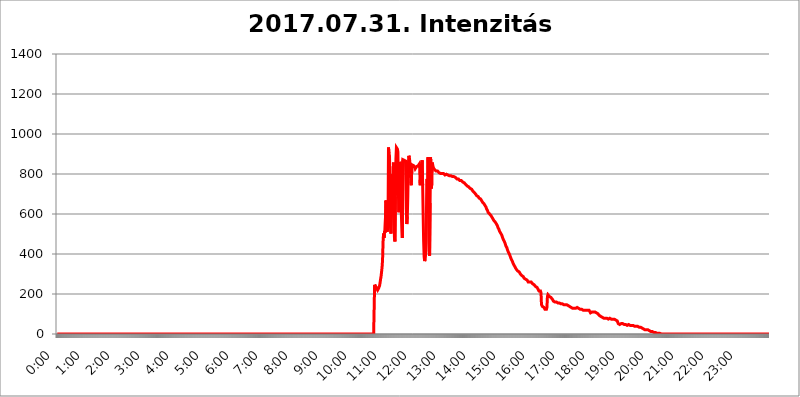
| Category | 2017.07.31. Intenzitás [W/m^2] |
|---|---|
| 0.0 | 0 |
| 0.0006944444444444445 | 0 |
| 0.001388888888888889 | 0 |
| 0.0020833333333333333 | 0 |
| 0.002777777777777778 | 0 |
| 0.003472222222222222 | 0 |
| 0.004166666666666667 | 0 |
| 0.004861111111111111 | 0 |
| 0.005555555555555556 | 0 |
| 0.0062499999999999995 | 0 |
| 0.006944444444444444 | 0 |
| 0.007638888888888889 | 0 |
| 0.008333333333333333 | 0 |
| 0.009027777777777779 | 0 |
| 0.009722222222222222 | 0 |
| 0.010416666666666666 | 0 |
| 0.011111111111111112 | 0 |
| 0.011805555555555555 | 0 |
| 0.012499999999999999 | 0 |
| 0.013194444444444444 | 0 |
| 0.013888888888888888 | 0 |
| 0.014583333333333332 | 0 |
| 0.015277777777777777 | 0 |
| 0.015972222222222224 | 0 |
| 0.016666666666666666 | 0 |
| 0.017361111111111112 | 0 |
| 0.018055555555555557 | 0 |
| 0.01875 | 0 |
| 0.019444444444444445 | 0 |
| 0.02013888888888889 | 0 |
| 0.020833333333333332 | 0 |
| 0.02152777777777778 | 0 |
| 0.022222222222222223 | 0 |
| 0.02291666666666667 | 0 |
| 0.02361111111111111 | 0 |
| 0.024305555555555556 | 0 |
| 0.024999999999999998 | 0 |
| 0.025694444444444447 | 0 |
| 0.02638888888888889 | 0 |
| 0.027083333333333334 | 0 |
| 0.027777777777777776 | 0 |
| 0.02847222222222222 | 0 |
| 0.029166666666666664 | 0 |
| 0.029861111111111113 | 0 |
| 0.030555555555555555 | 0 |
| 0.03125 | 0 |
| 0.03194444444444445 | 0 |
| 0.03263888888888889 | 0 |
| 0.03333333333333333 | 0 |
| 0.034027777777777775 | 0 |
| 0.034722222222222224 | 0 |
| 0.035416666666666666 | 0 |
| 0.036111111111111115 | 0 |
| 0.03680555555555556 | 0 |
| 0.0375 | 0 |
| 0.03819444444444444 | 0 |
| 0.03888888888888889 | 0 |
| 0.03958333333333333 | 0 |
| 0.04027777777777778 | 0 |
| 0.04097222222222222 | 0 |
| 0.041666666666666664 | 0 |
| 0.042361111111111106 | 0 |
| 0.04305555555555556 | 0 |
| 0.043750000000000004 | 0 |
| 0.044444444444444446 | 0 |
| 0.04513888888888889 | 0 |
| 0.04583333333333334 | 0 |
| 0.04652777777777778 | 0 |
| 0.04722222222222222 | 0 |
| 0.04791666666666666 | 0 |
| 0.04861111111111111 | 0 |
| 0.049305555555555554 | 0 |
| 0.049999999999999996 | 0 |
| 0.05069444444444445 | 0 |
| 0.051388888888888894 | 0 |
| 0.052083333333333336 | 0 |
| 0.05277777777777778 | 0 |
| 0.05347222222222222 | 0 |
| 0.05416666666666667 | 0 |
| 0.05486111111111111 | 0 |
| 0.05555555555555555 | 0 |
| 0.05625 | 0 |
| 0.05694444444444444 | 0 |
| 0.057638888888888885 | 0 |
| 0.05833333333333333 | 0 |
| 0.05902777777777778 | 0 |
| 0.059722222222222225 | 0 |
| 0.06041666666666667 | 0 |
| 0.061111111111111116 | 0 |
| 0.06180555555555556 | 0 |
| 0.0625 | 0 |
| 0.06319444444444444 | 0 |
| 0.06388888888888888 | 0 |
| 0.06458333333333334 | 0 |
| 0.06527777777777778 | 0 |
| 0.06597222222222222 | 0 |
| 0.06666666666666667 | 0 |
| 0.06736111111111111 | 0 |
| 0.06805555555555555 | 0 |
| 0.06874999999999999 | 0 |
| 0.06944444444444443 | 0 |
| 0.07013888888888889 | 0 |
| 0.07083333333333333 | 0 |
| 0.07152777777777779 | 0 |
| 0.07222222222222223 | 0 |
| 0.07291666666666667 | 0 |
| 0.07361111111111111 | 0 |
| 0.07430555555555556 | 0 |
| 0.075 | 0 |
| 0.07569444444444444 | 0 |
| 0.0763888888888889 | 0 |
| 0.07708333333333334 | 0 |
| 0.07777777777777778 | 0 |
| 0.07847222222222222 | 0 |
| 0.07916666666666666 | 0 |
| 0.0798611111111111 | 0 |
| 0.08055555555555556 | 0 |
| 0.08125 | 0 |
| 0.08194444444444444 | 0 |
| 0.08263888888888889 | 0 |
| 0.08333333333333333 | 0 |
| 0.08402777777777777 | 0 |
| 0.08472222222222221 | 0 |
| 0.08541666666666665 | 0 |
| 0.08611111111111112 | 0 |
| 0.08680555555555557 | 0 |
| 0.08750000000000001 | 0 |
| 0.08819444444444445 | 0 |
| 0.08888888888888889 | 0 |
| 0.08958333333333333 | 0 |
| 0.09027777777777778 | 0 |
| 0.09097222222222222 | 0 |
| 0.09166666666666667 | 0 |
| 0.09236111111111112 | 0 |
| 0.09305555555555556 | 0 |
| 0.09375 | 0 |
| 0.09444444444444444 | 0 |
| 0.09513888888888888 | 0 |
| 0.09583333333333333 | 0 |
| 0.09652777777777777 | 0 |
| 0.09722222222222222 | 0 |
| 0.09791666666666667 | 0 |
| 0.09861111111111111 | 0 |
| 0.09930555555555555 | 0 |
| 0.09999999999999999 | 0 |
| 0.10069444444444443 | 0 |
| 0.1013888888888889 | 0 |
| 0.10208333333333335 | 0 |
| 0.10277777777777779 | 0 |
| 0.10347222222222223 | 0 |
| 0.10416666666666667 | 0 |
| 0.10486111111111111 | 0 |
| 0.10555555555555556 | 0 |
| 0.10625 | 0 |
| 0.10694444444444444 | 0 |
| 0.1076388888888889 | 0 |
| 0.10833333333333334 | 0 |
| 0.10902777777777778 | 0 |
| 0.10972222222222222 | 0 |
| 0.1111111111111111 | 0 |
| 0.11180555555555556 | 0 |
| 0.11180555555555556 | 0 |
| 0.1125 | 0 |
| 0.11319444444444444 | 0 |
| 0.11388888888888889 | 0 |
| 0.11458333333333333 | 0 |
| 0.11527777777777777 | 0 |
| 0.11597222222222221 | 0 |
| 0.11666666666666665 | 0 |
| 0.1173611111111111 | 0 |
| 0.11805555555555557 | 0 |
| 0.11944444444444445 | 0 |
| 0.12013888888888889 | 0 |
| 0.12083333333333333 | 0 |
| 0.12152777777777778 | 0 |
| 0.12222222222222223 | 0 |
| 0.12291666666666667 | 0 |
| 0.12291666666666667 | 0 |
| 0.12361111111111112 | 0 |
| 0.12430555555555556 | 0 |
| 0.125 | 0 |
| 0.12569444444444444 | 0 |
| 0.12638888888888888 | 0 |
| 0.12708333333333333 | 0 |
| 0.16875 | 0 |
| 0.12847222222222224 | 0 |
| 0.12916666666666668 | 0 |
| 0.12986111111111112 | 0 |
| 0.13055555555555556 | 0 |
| 0.13125 | 0 |
| 0.13194444444444445 | 0 |
| 0.1326388888888889 | 0 |
| 0.13333333333333333 | 0 |
| 0.13402777777777777 | 0 |
| 0.13402777777777777 | 0 |
| 0.13472222222222222 | 0 |
| 0.13541666666666666 | 0 |
| 0.1361111111111111 | 0 |
| 0.13749999999999998 | 0 |
| 0.13819444444444443 | 0 |
| 0.1388888888888889 | 0 |
| 0.13958333333333334 | 0 |
| 0.14027777777777778 | 0 |
| 0.14097222222222222 | 0 |
| 0.14166666666666666 | 0 |
| 0.1423611111111111 | 0 |
| 0.14305555555555557 | 0 |
| 0.14375000000000002 | 0 |
| 0.14444444444444446 | 0 |
| 0.1451388888888889 | 0 |
| 0.1451388888888889 | 0 |
| 0.14652777777777778 | 0 |
| 0.14722222222222223 | 0 |
| 0.14791666666666667 | 0 |
| 0.1486111111111111 | 0 |
| 0.14930555555555555 | 0 |
| 0.15 | 0 |
| 0.15069444444444444 | 0 |
| 0.15138888888888888 | 0 |
| 0.15208333333333332 | 0 |
| 0.15277777777777776 | 0 |
| 0.15347222222222223 | 0 |
| 0.15416666666666667 | 0 |
| 0.15486111111111112 | 0 |
| 0.15555555555555556 | 0 |
| 0.15625 | 0 |
| 0.15694444444444444 | 0 |
| 0.15763888888888888 | 0 |
| 0.15833333333333333 | 0 |
| 0.15902777777777777 | 0 |
| 0.15972222222222224 | 0 |
| 0.16041666666666668 | 0 |
| 0.16111111111111112 | 0 |
| 0.16180555555555556 | 0 |
| 0.1625 | 0 |
| 0.16319444444444445 | 0 |
| 0.1638888888888889 | 0 |
| 0.16458333333333333 | 0 |
| 0.16527777777777777 | 0 |
| 0.16597222222222222 | 0 |
| 0.16666666666666666 | 0 |
| 0.1673611111111111 | 0 |
| 0.16805555555555554 | 0 |
| 0.16874999999999998 | 0 |
| 0.16944444444444443 | 0 |
| 0.17013888888888887 | 0 |
| 0.1708333333333333 | 0 |
| 0.17152777777777775 | 0 |
| 0.17222222222222225 | 0 |
| 0.1729166666666667 | 0 |
| 0.17361111111111113 | 0 |
| 0.17430555555555557 | 0 |
| 0.17500000000000002 | 0 |
| 0.17569444444444446 | 0 |
| 0.1763888888888889 | 0 |
| 0.17708333333333334 | 0 |
| 0.17777777777777778 | 0 |
| 0.17847222222222223 | 0 |
| 0.17916666666666667 | 0 |
| 0.1798611111111111 | 0 |
| 0.18055555555555555 | 0 |
| 0.18125 | 0 |
| 0.18194444444444444 | 0 |
| 0.1826388888888889 | 0 |
| 0.18333333333333335 | 0 |
| 0.1840277777777778 | 0 |
| 0.18472222222222223 | 0 |
| 0.18541666666666667 | 0 |
| 0.18611111111111112 | 0 |
| 0.18680555555555556 | 0 |
| 0.1875 | 0 |
| 0.18819444444444444 | 0 |
| 0.18888888888888888 | 0 |
| 0.18958333333333333 | 0 |
| 0.19027777777777777 | 0 |
| 0.1909722222222222 | 0 |
| 0.19166666666666665 | 0 |
| 0.19236111111111112 | 0 |
| 0.19305555555555554 | 0 |
| 0.19375 | 0 |
| 0.19444444444444445 | 0 |
| 0.1951388888888889 | 0 |
| 0.19583333333333333 | 0 |
| 0.19652777777777777 | 0 |
| 0.19722222222222222 | 0 |
| 0.19791666666666666 | 0 |
| 0.1986111111111111 | 0 |
| 0.19930555555555554 | 0 |
| 0.19999999999999998 | 0 |
| 0.20069444444444443 | 0 |
| 0.20138888888888887 | 0 |
| 0.2020833333333333 | 0 |
| 0.2027777777777778 | 0 |
| 0.2034722222222222 | 0 |
| 0.2041666666666667 | 0 |
| 0.20486111111111113 | 0 |
| 0.20555555555555557 | 0 |
| 0.20625000000000002 | 0 |
| 0.20694444444444446 | 0 |
| 0.2076388888888889 | 0 |
| 0.20833333333333334 | 0 |
| 0.20902777777777778 | 0 |
| 0.20972222222222223 | 0 |
| 0.21041666666666667 | 0 |
| 0.2111111111111111 | 0 |
| 0.21180555555555555 | 0 |
| 0.2125 | 0 |
| 0.21319444444444444 | 0 |
| 0.2138888888888889 | 0 |
| 0.21458333333333335 | 0 |
| 0.2152777777777778 | 0 |
| 0.21597222222222223 | 0 |
| 0.21666666666666667 | 0 |
| 0.21736111111111112 | 0 |
| 0.21805555555555556 | 0 |
| 0.21875 | 0 |
| 0.21944444444444444 | 0 |
| 0.22013888888888888 | 0 |
| 0.22083333333333333 | 0 |
| 0.22152777777777777 | 0 |
| 0.2222222222222222 | 0 |
| 0.22291666666666665 | 0 |
| 0.2236111111111111 | 0 |
| 0.22430555555555556 | 0 |
| 0.225 | 0 |
| 0.22569444444444445 | 0 |
| 0.2263888888888889 | 0 |
| 0.22708333333333333 | 0 |
| 0.22777777777777777 | 0 |
| 0.22847222222222222 | 0 |
| 0.22916666666666666 | 0 |
| 0.2298611111111111 | 0 |
| 0.23055555555555554 | 0 |
| 0.23124999999999998 | 0 |
| 0.23194444444444443 | 0 |
| 0.23263888888888887 | 0 |
| 0.2333333333333333 | 0 |
| 0.2340277777777778 | 0 |
| 0.2347222222222222 | 0 |
| 0.2354166666666667 | 0 |
| 0.23611111111111113 | 0 |
| 0.23680555555555557 | 0 |
| 0.23750000000000002 | 0 |
| 0.23819444444444446 | 0 |
| 0.2388888888888889 | 0 |
| 0.23958333333333334 | 0 |
| 0.24027777777777778 | 0 |
| 0.24097222222222223 | 0 |
| 0.24166666666666667 | 0 |
| 0.2423611111111111 | 0 |
| 0.24305555555555555 | 0 |
| 0.24375 | 0 |
| 0.24444444444444446 | 0 |
| 0.24513888888888888 | 0 |
| 0.24583333333333335 | 0 |
| 0.2465277777777778 | 0 |
| 0.24722222222222223 | 0 |
| 0.24791666666666667 | 0 |
| 0.24861111111111112 | 0 |
| 0.24930555555555556 | 0 |
| 0.25 | 0 |
| 0.25069444444444444 | 0 |
| 0.2513888888888889 | 0 |
| 0.2520833333333333 | 0 |
| 0.25277777777777777 | 0 |
| 0.2534722222222222 | 0 |
| 0.25416666666666665 | 0 |
| 0.2548611111111111 | 0 |
| 0.2555555555555556 | 0 |
| 0.25625000000000003 | 0 |
| 0.2569444444444445 | 0 |
| 0.2576388888888889 | 0 |
| 0.25833333333333336 | 0 |
| 0.2590277777777778 | 0 |
| 0.25972222222222224 | 0 |
| 0.2604166666666667 | 0 |
| 0.2611111111111111 | 0 |
| 0.26180555555555557 | 0 |
| 0.2625 | 0 |
| 0.26319444444444445 | 0 |
| 0.2638888888888889 | 0 |
| 0.26458333333333334 | 0 |
| 0.2652777777777778 | 0 |
| 0.2659722222222222 | 0 |
| 0.26666666666666666 | 0 |
| 0.2673611111111111 | 0 |
| 0.26805555555555555 | 0 |
| 0.26875 | 0 |
| 0.26944444444444443 | 0 |
| 0.2701388888888889 | 0 |
| 0.2708333333333333 | 0 |
| 0.27152777777777776 | 0 |
| 0.2722222222222222 | 0 |
| 0.27291666666666664 | 0 |
| 0.2736111111111111 | 0 |
| 0.2743055555555555 | 0 |
| 0.27499999999999997 | 0 |
| 0.27569444444444446 | 0 |
| 0.27638888888888885 | 0 |
| 0.27708333333333335 | 0 |
| 0.2777777777777778 | 0 |
| 0.27847222222222223 | 0 |
| 0.2791666666666667 | 0 |
| 0.2798611111111111 | 0 |
| 0.28055555555555556 | 0 |
| 0.28125 | 0 |
| 0.28194444444444444 | 0 |
| 0.2826388888888889 | 0 |
| 0.2833333333333333 | 0 |
| 0.28402777777777777 | 0 |
| 0.2847222222222222 | 0 |
| 0.28541666666666665 | 0 |
| 0.28611111111111115 | 0 |
| 0.28680555555555554 | 0 |
| 0.28750000000000003 | 0 |
| 0.2881944444444445 | 0 |
| 0.2888888888888889 | 0 |
| 0.28958333333333336 | 0 |
| 0.2902777777777778 | 0 |
| 0.29097222222222224 | 0 |
| 0.2916666666666667 | 0 |
| 0.2923611111111111 | 0 |
| 0.29305555555555557 | 0 |
| 0.29375 | 0 |
| 0.29444444444444445 | 0 |
| 0.2951388888888889 | 0 |
| 0.29583333333333334 | 0 |
| 0.2965277777777778 | 0 |
| 0.2972222222222222 | 0 |
| 0.29791666666666666 | 0 |
| 0.2986111111111111 | 0 |
| 0.29930555555555555 | 0 |
| 0.3 | 0 |
| 0.30069444444444443 | 0 |
| 0.3013888888888889 | 0 |
| 0.3020833333333333 | 0 |
| 0.30277777777777776 | 0 |
| 0.3034722222222222 | 0 |
| 0.30416666666666664 | 0 |
| 0.3048611111111111 | 0 |
| 0.3055555555555555 | 0 |
| 0.30624999999999997 | 0 |
| 0.3069444444444444 | 0 |
| 0.3076388888888889 | 0 |
| 0.30833333333333335 | 0 |
| 0.3090277777777778 | 0 |
| 0.30972222222222223 | 0 |
| 0.3104166666666667 | 0 |
| 0.3111111111111111 | 0 |
| 0.31180555555555556 | 0 |
| 0.3125 | 0 |
| 0.31319444444444444 | 0 |
| 0.3138888888888889 | 0 |
| 0.3145833333333333 | 0 |
| 0.31527777777777777 | 0 |
| 0.3159722222222222 | 0 |
| 0.31666666666666665 | 0 |
| 0.31736111111111115 | 0 |
| 0.31805555555555554 | 0 |
| 0.31875000000000003 | 0 |
| 0.3194444444444445 | 0 |
| 0.3201388888888889 | 0 |
| 0.32083333333333336 | 0 |
| 0.3215277777777778 | 0 |
| 0.32222222222222224 | 0 |
| 0.3229166666666667 | 0 |
| 0.3236111111111111 | 0 |
| 0.32430555555555557 | 0 |
| 0.325 | 0 |
| 0.32569444444444445 | 0 |
| 0.3263888888888889 | 0 |
| 0.32708333333333334 | 0 |
| 0.3277777777777778 | 0 |
| 0.3284722222222222 | 0 |
| 0.32916666666666666 | 0 |
| 0.3298611111111111 | 0 |
| 0.33055555555555555 | 0 |
| 0.33125 | 0 |
| 0.33194444444444443 | 0 |
| 0.3326388888888889 | 0 |
| 0.3333333333333333 | 0 |
| 0.3340277777777778 | 0 |
| 0.3347222222222222 | 0 |
| 0.3354166666666667 | 0 |
| 0.3361111111111111 | 0 |
| 0.3368055555555556 | 0 |
| 0.33749999999999997 | 0 |
| 0.33819444444444446 | 0 |
| 0.33888888888888885 | 0 |
| 0.33958333333333335 | 0 |
| 0.34027777777777773 | 0 |
| 0.34097222222222223 | 0 |
| 0.3416666666666666 | 0 |
| 0.3423611111111111 | 0 |
| 0.3430555555555555 | 0 |
| 0.34375 | 0 |
| 0.3444444444444445 | 0 |
| 0.3451388888888889 | 0 |
| 0.3458333333333334 | 0 |
| 0.34652777777777777 | 0 |
| 0.34722222222222227 | 0 |
| 0.34791666666666665 | 0 |
| 0.34861111111111115 | 0 |
| 0.34930555555555554 | 0 |
| 0.35000000000000003 | 0 |
| 0.3506944444444444 | 0 |
| 0.3513888888888889 | 0 |
| 0.3520833333333333 | 0 |
| 0.3527777777777778 | 0 |
| 0.3534722222222222 | 0 |
| 0.3541666666666667 | 0 |
| 0.3548611111111111 | 0 |
| 0.35555555555555557 | 0 |
| 0.35625 | 0 |
| 0.35694444444444445 | 0 |
| 0.3576388888888889 | 0 |
| 0.35833333333333334 | 0 |
| 0.3590277777777778 | 0 |
| 0.3597222222222222 | 0 |
| 0.36041666666666666 | 0 |
| 0.3611111111111111 | 0 |
| 0.36180555555555555 | 0 |
| 0.3625 | 0 |
| 0.36319444444444443 | 0 |
| 0.3638888888888889 | 0 |
| 0.3645833333333333 | 0 |
| 0.3652777777777778 | 0 |
| 0.3659722222222222 | 0 |
| 0.3666666666666667 | 0 |
| 0.3673611111111111 | 0 |
| 0.3680555555555556 | 0 |
| 0.36874999999999997 | 0 |
| 0.36944444444444446 | 0 |
| 0.37013888888888885 | 0 |
| 0.37083333333333335 | 0 |
| 0.37152777777777773 | 0 |
| 0.37222222222222223 | 0 |
| 0.3729166666666666 | 0 |
| 0.3736111111111111 | 0 |
| 0.3743055555555555 | 0 |
| 0.375 | 0 |
| 0.3756944444444445 | 0 |
| 0.3763888888888889 | 0 |
| 0.3770833333333334 | 0 |
| 0.37777777777777777 | 0 |
| 0.37847222222222227 | 0 |
| 0.37916666666666665 | 0 |
| 0.37986111111111115 | 0 |
| 0.38055555555555554 | 0 |
| 0.38125000000000003 | 0 |
| 0.3819444444444444 | 0 |
| 0.3826388888888889 | 0 |
| 0.3833333333333333 | 0 |
| 0.3840277777777778 | 0 |
| 0.3847222222222222 | 0 |
| 0.3854166666666667 | 0 |
| 0.3861111111111111 | 0 |
| 0.38680555555555557 | 0 |
| 0.3875 | 0 |
| 0.38819444444444445 | 0 |
| 0.3888888888888889 | 0 |
| 0.38958333333333334 | 0 |
| 0.3902777777777778 | 0 |
| 0.3909722222222222 | 0 |
| 0.39166666666666666 | 0 |
| 0.3923611111111111 | 0 |
| 0.39305555555555555 | 0 |
| 0.39375 | 0 |
| 0.39444444444444443 | 0 |
| 0.3951388888888889 | 0 |
| 0.3958333333333333 | 0 |
| 0.3965277777777778 | 0 |
| 0.3972222222222222 | 0 |
| 0.3979166666666667 | 0 |
| 0.3986111111111111 | 0 |
| 0.3993055555555556 | 0 |
| 0.39999999999999997 | 0 |
| 0.40069444444444446 | 0 |
| 0.40138888888888885 | 0 |
| 0.40208333333333335 | 0 |
| 0.40277777777777773 | 0 |
| 0.40347222222222223 | 0 |
| 0.4041666666666666 | 0 |
| 0.4048611111111111 | 0 |
| 0.4055555555555555 | 0 |
| 0.40625 | 0 |
| 0.4069444444444445 | 0 |
| 0.4076388888888889 | 0 |
| 0.4083333333333334 | 0 |
| 0.40902777777777777 | 0 |
| 0.40972222222222227 | 0 |
| 0.41041666666666665 | 0 |
| 0.41111111111111115 | 0 |
| 0.41180555555555554 | 0 |
| 0.41250000000000003 | 0 |
| 0.4131944444444444 | 0 |
| 0.4138888888888889 | 0 |
| 0.4145833333333333 | 0 |
| 0.4152777777777778 | 0 |
| 0.4159722222222222 | 0 |
| 0.4166666666666667 | 0 |
| 0.4173611111111111 | 0 |
| 0.41805555555555557 | 0 |
| 0.41875 | 0 |
| 0.41944444444444445 | 0 |
| 0.4201388888888889 | 0 |
| 0.42083333333333334 | 0 |
| 0.4215277777777778 | 0 |
| 0.4222222222222222 | 0 |
| 0.42291666666666666 | 0 |
| 0.4236111111111111 | 0 |
| 0.42430555555555555 | 0 |
| 0.425 | 0 |
| 0.42569444444444443 | 0 |
| 0.4263888888888889 | 0 |
| 0.4270833333333333 | 0 |
| 0.4277777777777778 | 0 |
| 0.4284722222222222 | 0 |
| 0.4291666666666667 | 0 |
| 0.4298611111111111 | 0 |
| 0.4305555555555556 | 0 |
| 0.43124999999999997 | 0 |
| 0.43194444444444446 | 0 |
| 0.43263888888888885 | 0 |
| 0.43333333333333335 | 0 |
| 0.43402777777777773 | 0 |
| 0.43472222222222223 | 0 |
| 0.4354166666666666 | 0 |
| 0.4361111111111111 | 0 |
| 0.4368055555555555 | 0 |
| 0.4375 | 0 |
| 0.4381944444444445 | 0 |
| 0.4388888888888889 | 0 |
| 0.4395833333333334 | 0 |
| 0.44027777777777777 | 0 |
| 0.44097222222222227 | 0 |
| 0.44166666666666665 | 0 |
| 0.44236111111111115 | 0 |
| 0.44305555555555554 | 0 |
| 0.44375000000000003 | 0 |
| 0.4444444444444444 | 0 |
| 0.4451388888888889 | 246.689 |
| 0.4458333333333333 | 242.127 |
| 0.4465277777777778 | 237.564 |
| 0.4472222222222222 | 233 |
| 0.4479166666666667 | 228.436 |
| 0.4486111111111111 | 223.873 |
| 0.44930555555555557 | 219.309 |
| 0.45 | 219.309 |
| 0.45069444444444445 | 228.436 |
| 0.4513888888888889 | 233 |
| 0.45208333333333334 | 242.127 |
| 0.4527777777777778 | 255.813 |
| 0.4534722222222222 | 274.047 |
| 0.45416666666666666 | 287.709 |
| 0.4548611111111111 | 310.44 |
| 0.45555555555555555 | 333.113 |
| 0.45625 | 369.23 |
| 0.45694444444444443 | 458.38 |
| 0.4576388888888889 | 502.192 |
| 0.4583333333333333 | 480.356 |
| 0.4590277777777778 | 515.223 |
| 0.4597222222222222 | 506.542 |
| 0.4604166666666667 | 510.885 |
| 0.4611111111111111 | 667.123 |
| 0.4618055555555556 | 617.436 |
| 0.46249999999999997 | 510.885 |
| 0.46319444444444446 | 515.223 |
| 0.46388888888888885 | 536.82 |
| 0.46458333333333335 | 932.576 |
| 0.46527777777777773 | 902.447 |
| 0.46597222222222223 | 891.099 |
| 0.4666666666666666 | 767.62 |
| 0.4673611111111111 | 541.121 |
| 0.4680555555555555 | 502.192 |
| 0.46875 | 502.192 |
| 0.4694444444444445 | 719.877 |
| 0.4701388888888889 | 798.974 |
| 0.4708333333333334 | 719.877 |
| 0.47152777777777777 | 856.855 |
| 0.47222222222222227 | 679.395 |
| 0.47291666666666665 | 484.735 |
| 0.47361111111111115 | 462.786 |
| 0.47430555555555554 | 687.544 |
| 0.47500000000000003 | 875.918 |
| 0.4756944444444444 | 932.576 |
| 0.4763888888888889 | 936.33 |
| 0.4770833333333333 | 925.06 |
| 0.4777777777777778 | 909.996 |
| 0.4784722222222222 | 703.762 |
| 0.4791666666666667 | 609.062 |
| 0.4798611111111111 | 779.42 |
| 0.48055555555555557 | 860.676 |
| 0.48125 | 853.029 |
| 0.48194444444444445 | 841.526 |
| 0.4826388888888889 | 596.45 |
| 0.48333333333333334 | 528.2 |
| 0.4840277777777778 | 480.356 |
| 0.4847222222222222 | 872.114 |
| 0.48541666666666666 | 868.305 |
| 0.4861111111111111 | 868.305 |
| 0.48680555555555555 | 868.305 |
| 0.4875 | 868.305 |
| 0.48819444444444443 | 868.305 |
| 0.4888888888888889 | 864.493 |
| 0.4895833333333333 | 617.436 |
| 0.4902777777777778 | 549.704 |
| 0.4909722222222222 | 588.009 |
| 0.4916666666666667 | 691.608 |
| 0.4923611111111111 | 841.526 |
| 0.4930555555555556 | 891.099 |
| 0.49374999999999997 | 883.516 |
| 0.49444444444444446 | 864.493 |
| 0.49513888888888885 | 833.834 |
| 0.49583333333333335 | 759.723 |
| 0.49652777777777773 | 743.859 |
| 0.49722222222222223 | 826.123 |
| 0.4979166666666666 | 845.365 |
| 0.4986111111111111 | 841.526 |
| 0.4993055555555555 | 841.526 |
| 0.5 | 841.526 |
| 0.5006944444444444 | 837.682 |
| 0.5013888888888889 | 833.834 |
| 0.5020833333333333 | 826.123 |
| 0.5027777777777778 | 822.26 |
| 0.5034722222222222 | 829.981 |
| 0.5041666666666667 | 837.682 |
| 0.5048611111111111 | 841.526 |
| 0.5055555555555555 | 841.526 |
| 0.50625 | 841.526 |
| 0.5069444444444444 | 845.365 |
| 0.5076388888888889 | 849.199 |
| 0.5083333333333333 | 829.981 |
| 0.5090277777777777 | 743.859 |
| 0.5097222222222222 | 814.519 |
| 0.5104166666666666 | 826.123 |
| 0.5111111111111112 | 853.029 |
| 0.5118055555555555 | 868.305 |
| 0.5125000000000001 | 743.859 |
| 0.5131944444444444 | 596.45 |
| 0.513888888888889 | 462.786 |
| 0.5145833333333333 | 387.202 |
| 0.5152777777777778 | 364.728 |
| 0.5159722222222222 | 373.729 |
| 0.5166666666666667 | 400.638 |
| 0.517361111111111 | 462.786 |
| 0.5180555555555556 | 683.473 |
| 0.5187499999999999 | 775.492 |
| 0.5194444444444445 | 600.661 |
| 0.5201388888888888 | 883.516 |
| 0.5208333333333334 | 642.4 |
| 0.5215277777777778 | 414.035 |
| 0.5222222222222223 | 391.685 |
| 0.5229166666666667 | 654.791 |
| 0.5236111111111111 | 883.516 |
| 0.5243055555555556 | 798.974 |
| 0.525 | 727.896 |
| 0.5256944444444445 | 856.855 |
| 0.5263888888888889 | 849.199 |
| 0.5270833333333333 | 837.682 |
| 0.5277777777777778 | 829.981 |
| 0.5284722222222222 | 826.123 |
| 0.5291666666666667 | 822.26 |
| 0.5298611111111111 | 822.26 |
| 0.5305555555555556 | 818.392 |
| 0.53125 | 814.519 |
| 0.5319444444444444 | 810.641 |
| 0.5326388888888889 | 810.641 |
| 0.5333333333333333 | 814.519 |
| 0.5340277777777778 | 814.519 |
| 0.5347222222222222 | 810.641 |
| 0.5354166666666667 | 806.757 |
| 0.5361111111111111 | 806.757 |
| 0.5368055555555555 | 806.757 |
| 0.5375 | 802.868 |
| 0.5381944444444444 | 802.868 |
| 0.5388888888888889 | 802.868 |
| 0.5395833333333333 | 802.868 |
| 0.5402777777777777 | 802.868 |
| 0.5409722222222222 | 802.868 |
| 0.5416666666666666 | 802.868 |
| 0.5423611111111112 | 806.757 |
| 0.5430555555555555 | 798.974 |
| 0.5437500000000001 | 795.074 |
| 0.5444444444444444 | 795.074 |
| 0.545138888888889 | 795.074 |
| 0.5458333333333333 | 798.974 |
| 0.5465277777777778 | 795.074 |
| 0.5472222222222222 | 795.074 |
| 0.5479166666666667 | 795.074 |
| 0.548611111111111 | 795.074 |
| 0.5493055555555556 | 795.074 |
| 0.5499999999999999 | 791.169 |
| 0.5506944444444445 | 791.169 |
| 0.5513888888888888 | 791.169 |
| 0.5520833333333334 | 791.169 |
| 0.5527777777777778 | 791.169 |
| 0.5534722222222223 | 787.258 |
| 0.5541666666666667 | 787.258 |
| 0.5548611111111111 | 787.258 |
| 0.5555555555555556 | 787.258 |
| 0.55625 | 787.258 |
| 0.5569444444444445 | 787.258 |
| 0.5576388888888889 | 783.342 |
| 0.5583333333333333 | 783.342 |
| 0.5590277777777778 | 779.42 |
| 0.5597222222222222 | 779.42 |
| 0.5604166666666667 | 775.492 |
| 0.5611111111111111 | 779.42 |
| 0.5618055555555556 | 775.492 |
| 0.5625 | 775.492 |
| 0.5631944444444444 | 775.492 |
| 0.5638888888888889 | 771.559 |
| 0.5645833333333333 | 767.62 |
| 0.5652777777777778 | 767.62 |
| 0.5659722222222222 | 767.62 |
| 0.5666666666666667 | 767.62 |
| 0.5673611111111111 | 763.674 |
| 0.5680555555555555 | 763.674 |
| 0.56875 | 759.723 |
| 0.5694444444444444 | 759.723 |
| 0.5701388888888889 | 755.766 |
| 0.5708333333333333 | 755.766 |
| 0.5715277777777777 | 755.766 |
| 0.5722222222222222 | 751.803 |
| 0.5729166666666666 | 747.834 |
| 0.5736111111111112 | 747.834 |
| 0.5743055555555555 | 743.859 |
| 0.5750000000000001 | 739.877 |
| 0.5756944444444444 | 739.877 |
| 0.576388888888889 | 739.877 |
| 0.5770833333333333 | 735.89 |
| 0.5777777777777778 | 735.89 |
| 0.5784722222222222 | 731.896 |
| 0.5791666666666667 | 727.896 |
| 0.579861111111111 | 727.896 |
| 0.5805555555555556 | 727.896 |
| 0.5812499999999999 | 723.889 |
| 0.5819444444444445 | 719.877 |
| 0.5826388888888888 | 715.858 |
| 0.5833333333333334 | 715.858 |
| 0.5840277777777778 | 711.832 |
| 0.5847222222222223 | 707.8 |
| 0.5854166666666667 | 707.8 |
| 0.5861111111111111 | 703.762 |
| 0.5868055555555556 | 699.717 |
| 0.5875 | 695.666 |
| 0.5881944444444445 | 691.608 |
| 0.5888888888888889 | 691.608 |
| 0.5895833333333333 | 691.608 |
| 0.5902777777777778 | 687.544 |
| 0.5909722222222222 | 683.473 |
| 0.5916666666666667 | 679.395 |
| 0.5923611111111111 | 679.395 |
| 0.5930555555555556 | 675.311 |
| 0.59375 | 675.311 |
| 0.5944444444444444 | 671.22 |
| 0.5951388888888889 | 667.123 |
| 0.5958333333333333 | 667.123 |
| 0.5965277777777778 | 658.909 |
| 0.5972222222222222 | 658.909 |
| 0.5979166666666667 | 654.791 |
| 0.5986111111111111 | 650.667 |
| 0.5993055555555555 | 646.537 |
| 0.6 | 642.4 |
| 0.6006944444444444 | 638.256 |
| 0.6013888888888889 | 634.105 |
| 0.6020833333333333 | 625.784 |
| 0.6027777777777777 | 625.784 |
| 0.6034722222222222 | 617.436 |
| 0.6041666666666666 | 609.062 |
| 0.6048611111111112 | 609.062 |
| 0.6055555555555555 | 604.864 |
| 0.6062500000000001 | 600.661 |
| 0.6069444444444444 | 600.661 |
| 0.607638888888889 | 596.45 |
| 0.6083333333333333 | 592.233 |
| 0.6090277777777778 | 588.009 |
| 0.6097222222222222 | 583.779 |
| 0.6104166666666667 | 583.779 |
| 0.611111111111111 | 575.299 |
| 0.6118055555555556 | 575.299 |
| 0.6124999999999999 | 566.793 |
| 0.6131944444444445 | 562.53 |
| 0.6138888888888888 | 562.53 |
| 0.6145833333333334 | 558.261 |
| 0.6152777777777778 | 553.986 |
| 0.6159722222222223 | 549.704 |
| 0.6166666666666667 | 545.416 |
| 0.6173611111111111 | 541.121 |
| 0.6180555555555556 | 532.513 |
| 0.61875 | 528.2 |
| 0.6194444444444445 | 523.88 |
| 0.6201388888888889 | 515.223 |
| 0.6208333333333333 | 515.223 |
| 0.6215277777777778 | 510.885 |
| 0.6222222222222222 | 502.192 |
| 0.6229166666666667 | 497.836 |
| 0.6236111111111111 | 493.475 |
| 0.6243055555555556 | 484.735 |
| 0.625 | 480.356 |
| 0.6256944444444444 | 471.582 |
| 0.6263888888888889 | 467.187 |
| 0.6270833333333333 | 462.786 |
| 0.6277777777777778 | 458.38 |
| 0.6284722222222222 | 449.551 |
| 0.6291666666666667 | 440.702 |
| 0.6298611111111111 | 436.27 |
| 0.6305555555555555 | 431.833 |
| 0.63125 | 422.943 |
| 0.6319444444444444 | 418.492 |
| 0.6326388888888889 | 409.574 |
| 0.6333333333333333 | 405.108 |
| 0.6340277777777777 | 400.638 |
| 0.6347222222222222 | 396.164 |
| 0.6354166666666666 | 387.202 |
| 0.6361111111111112 | 382.715 |
| 0.6368055555555555 | 373.729 |
| 0.6375000000000001 | 369.23 |
| 0.6381944444444444 | 364.728 |
| 0.638888888888889 | 360.221 |
| 0.6395833333333333 | 351.198 |
| 0.6402777777777778 | 346.682 |
| 0.6409722222222222 | 342.162 |
| 0.6416666666666667 | 337.639 |
| 0.642361111111111 | 333.113 |
| 0.6430555555555556 | 328.584 |
| 0.6437499999999999 | 324.052 |
| 0.6444444444444445 | 324.052 |
| 0.6451388888888888 | 319.517 |
| 0.6458333333333334 | 314.98 |
| 0.6465277777777778 | 314.98 |
| 0.6472222222222223 | 314.98 |
| 0.6479166666666667 | 310.44 |
| 0.6486111111111111 | 305.898 |
| 0.6493055555555556 | 301.354 |
| 0.65 | 296.808 |
| 0.6506944444444445 | 296.808 |
| 0.6513888888888889 | 292.259 |
| 0.6520833333333333 | 292.259 |
| 0.6527777777777778 | 287.709 |
| 0.6534722222222222 | 287.709 |
| 0.6541666666666667 | 283.156 |
| 0.6548611111111111 | 278.603 |
| 0.6555555555555556 | 278.603 |
| 0.65625 | 278.603 |
| 0.6569444444444444 | 274.047 |
| 0.6576388888888889 | 274.047 |
| 0.6583333333333333 | 269.49 |
| 0.6590277777777778 | 269.49 |
| 0.6597222222222222 | 264.932 |
| 0.6604166666666667 | 260.373 |
| 0.6611111111111111 | 260.373 |
| 0.6618055555555555 | 264.932 |
| 0.6625 | 260.373 |
| 0.6631944444444444 | 260.373 |
| 0.6638888888888889 | 264.932 |
| 0.6645833333333333 | 260.373 |
| 0.6652777777777777 | 255.813 |
| 0.6659722222222222 | 255.813 |
| 0.6666666666666666 | 251.251 |
| 0.6673611111111111 | 251.251 |
| 0.6680555555555556 | 251.251 |
| 0.6687500000000001 | 246.689 |
| 0.6694444444444444 | 242.127 |
| 0.6701388888888888 | 242.127 |
| 0.6708333333333334 | 237.564 |
| 0.6715277777777778 | 237.564 |
| 0.6722222222222222 | 237.564 |
| 0.6729166666666666 | 233 |
| 0.6736111111111112 | 228.436 |
| 0.6743055555555556 | 223.873 |
| 0.6749999999999999 | 219.309 |
| 0.6756944444444444 | 214.746 |
| 0.6763888888888889 | 214.746 |
| 0.6770833333333334 | 214.746 |
| 0.6777777777777777 | 214.746 |
| 0.6784722222222223 | 205.62 |
| 0.6791666666666667 | 146.423 |
| 0.6798611111111111 | 141.884 |
| 0.6805555555555555 | 137.347 |
| 0.68125 | 137.347 |
| 0.6819444444444445 | 132.814 |
| 0.6826388888888889 | 132.814 |
| 0.6833333333333332 | 128.284 |
| 0.6840277777777778 | 123.758 |
| 0.6847222222222222 | 123.758 |
| 0.6854166666666667 | 123.758 |
| 0.686111111111111 | 123.758 |
| 0.6868055555555556 | 132.814 |
| 0.6875 | 187.378 |
| 0.6881944444444444 | 196.497 |
| 0.688888888888889 | 191.937 |
| 0.6895833333333333 | 191.937 |
| 0.6902777777777778 | 187.378 |
| 0.6909722222222222 | 187.378 |
| 0.6916666666666668 | 182.82 |
| 0.6923611111111111 | 182.82 |
| 0.6930555555555555 | 182.82 |
| 0.69375 | 178.264 |
| 0.6944444444444445 | 173.709 |
| 0.6951388888888889 | 169.156 |
| 0.6958333333333333 | 164.605 |
| 0.6965277777777777 | 164.605 |
| 0.6972222222222223 | 160.056 |
| 0.6979166666666666 | 160.056 |
| 0.6986111111111111 | 160.056 |
| 0.6993055555555556 | 160.056 |
| 0.7000000000000001 | 160.056 |
| 0.7006944444444444 | 160.056 |
| 0.7013888888888888 | 160.056 |
| 0.7020833333333334 | 155.509 |
| 0.7027777777777778 | 155.509 |
| 0.7034722222222222 | 155.509 |
| 0.7041666666666666 | 155.509 |
| 0.7048611111111112 | 155.509 |
| 0.7055555555555556 | 155.509 |
| 0.7062499999999999 | 150.964 |
| 0.7069444444444444 | 150.964 |
| 0.7076388888888889 | 150.964 |
| 0.7083333333333334 | 150.964 |
| 0.7090277777777777 | 146.423 |
| 0.7097222222222223 | 146.423 |
| 0.7104166666666667 | 146.423 |
| 0.7111111111111111 | 146.423 |
| 0.7118055555555555 | 146.423 |
| 0.7125 | 146.423 |
| 0.7131944444444445 | 146.423 |
| 0.7138888888888889 | 146.423 |
| 0.7145833333333332 | 146.423 |
| 0.7152777777777778 | 146.423 |
| 0.7159722222222222 | 141.884 |
| 0.7166666666666667 | 141.884 |
| 0.717361111111111 | 137.347 |
| 0.7180555555555556 | 137.347 |
| 0.71875 | 137.347 |
| 0.7194444444444444 | 137.347 |
| 0.720138888888889 | 132.814 |
| 0.7208333333333333 | 132.814 |
| 0.7215277777777778 | 128.284 |
| 0.7222222222222222 | 128.284 |
| 0.7229166666666668 | 128.284 |
| 0.7236111111111111 | 128.284 |
| 0.7243055555555555 | 128.284 |
| 0.725 | 128.284 |
| 0.7256944444444445 | 128.284 |
| 0.7263888888888889 | 128.284 |
| 0.7270833333333333 | 128.284 |
| 0.7277777777777777 | 128.284 |
| 0.7284722222222223 | 128.284 |
| 0.7291666666666666 | 132.814 |
| 0.7298611111111111 | 128.284 |
| 0.7305555555555556 | 128.284 |
| 0.7312500000000001 | 128.284 |
| 0.7319444444444444 | 128.284 |
| 0.7326388888888888 | 128.284 |
| 0.7333333333333334 | 123.758 |
| 0.7340277777777778 | 119.235 |
| 0.7347222222222222 | 123.758 |
| 0.7354166666666666 | 123.758 |
| 0.7361111111111112 | 119.235 |
| 0.7368055555555556 | 119.235 |
| 0.7374999999999999 | 119.235 |
| 0.7381944444444444 | 119.235 |
| 0.7388888888888889 | 119.235 |
| 0.7395833333333334 | 119.235 |
| 0.7402777777777777 | 119.235 |
| 0.7409722222222223 | 119.235 |
| 0.7416666666666667 | 119.235 |
| 0.7423611111111111 | 119.235 |
| 0.7430555555555555 | 119.235 |
| 0.74375 | 119.235 |
| 0.7444444444444445 | 119.235 |
| 0.7451388888888889 | 119.235 |
| 0.7458333333333332 | 119.235 |
| 0.7465277777777778 | 114.716 |
| 0.7472222222222222 | 114.716 |
| 0.7479166666666667 | 105.69 |
| 0.748611111111111 | 110.201 |
| 0.7493055555555556 | 110.201 |
| 0.75 | 110.201 |
| 0.7506944444444444 | 110.201 |
| 0.751388888888889 | 110.201 |
| 0.7520833333333333 | 110.201 |
| 0.7527777777777778 | 110.201 |
| 0.7534722222222222 | 110.201 |
| 0.7541666666666668 | 110.201 |
| 0.7548611111111111 | 105.69 |
| 0.7555555555555555 | 105.69 |
| 0.75625 | 105.69 |
| 0.7569444444444445 | 105.69 |
| 0.7576388888888889 | 101.184 |
| 0.7583333333333333 | 101.184 |
| 0.7590277777777777 | 96.682 |
| 0.7597222222222223 | 96.682 |
| 0.7604166666666666 | 92.184 |
| 0.7611111111111111 | 92.184 |
| 0.7618055555555556 | 92.184 |
| 0.7625000000000001 | 87.692 |
| 0.7631944444444444 | 87.692 |
| 0.7638888888888888 | 87.692 |
| 0.7645833333333334 | 83.205 |
| 0.7652777777777778 | 83.205 |
| 0.7659722222222222 | 83.205 |
| 0.7666666666666666 | 78.722 |
| 0.7673611111111112 | 78.722 |
| 0.7680555555555556 | 74.246 |
| 0.7687499999999999 | 78.722 |
| 0.7694444444444444 | 78.722 |
| 0.7701388888888889 | 78.722 |
| 0.7708333333333334 | 78.722 |
| 0.7715277777777777 | 78.722 |
| 0.7722222222222223 | 78.722 |
| 0.7729166666666667 | 74.246 |
| 0.7736111111111111 | 78.722 |
| 0.7743055555555555 | 78.722 |
| 0.775 | 78.722 |
| 0.7756944444444445 | 74.246 |
| 0.7763888888888889 | 74.246 |
| 0.7770833333333332 | 74.246 |
| 0.7777777777777778 | 78.722 |
| 0.7784722222222222 | 74.246 |
| 0.7791666666666667 | 74.246 |
| 0.779861111111111 | 74.246 |
| 0.7805555555555556 | 74.246 |
| 0.78125 | 74.246 |
| 0.7819444444444444 | 74.246 |
| 0.782638888888889 | 69.775 |
| 0.7833333333333333 | 69.775 |
| 0.7840277777777778 | 69.775 |
| 0.7847222222222222 | 65.31 |
| 0.7854166666666668 | 65.31 |
| 0.7861111111111111 | 60.85 |
| 0.7868055555555555 | 51.951 |
| 0.7875 | 51.951 |
| 0.7881944444444445 | 51.951 |
| 0.7888888888888889 | 47.511 |
| 0.7895833333333333 | 51.951 |
| 0.7902777777777777 | 51.951 |
| 0.7909722222222223 | 51.951 |
| 0.7916666666666666 | 51.951 |
| 0.7923611111111111 | 51.951 |
| 0.7930555555555556 | 51.951 |
| 0.7937500000000001 | 47.511 |
| 0.7944444444444444 | 47.511 |
| 0.7951388888888888 | 47.511 |
| 0.7958333333333334 | 47.511 |
| 0.7965277777777778 | 47.511 |
| 0.7972222222222222 | 47.511 |
| 0.7979166666666666 | 47.511 |
| 0.7986111111111112 | 47.511 |
| 0.7993055555555556 | 43.079 |
| 0.7999999999999999 | 47.511 |
| 0.8006944444444444 | 43.079 |
| 0.8013888888888889 | 47.511 |
| 0.8020833333333334 | 43.079 |
| 0.8027777777777777 | 43.079 |
| 0.8034722222222223 | 43.079 |
| 0.8041666666666667 | 43.079 |
| 0.8048611111111111 | 43.079 |
| 0.8055555555555555 | 43.079 |
| 0.80625 | 43.079 |
| 0.8069444444444445 | 43.079 |
| 0.8076388888888889 | 43.079 |
| 0.8083333333333332 | 43.079 |
| 0.8090277777777778 | 43.079 |
| 0.8097222222222222 | 38.653 |
| 0.8104166666666667 | 38.653 |
| 0.811111111111111 | 38.653 |
| 0.8118055555555556 | 38.653 |
| 0.8125 | 38.653 |
| 0.8131944444444444 | 38.653 |
| 0.813888888888889 | 38.653 |
| 0.8145833333333333 | 38.653 |
| 0.8152777777777778 | 34.234 |
| 0.8159722222222222 | 34.234 |
| 0.8166666666666668 | 34.234 |
| 0.8173611111111111 | 34.234 |
| 0.8180555555555555 | 34.234 |
| 0.81875 | 29.823 |
| 0.8194444444444445 | 29.823 |
| 0.8201388888888889 | 29.823 |
| 0.8208333333333333 | 29.823 |
| 0.8215277777777777 | 25.419 |
| 0.8222222222222223 | 25.419 |
| 0.8229166666666666 | 25.419 |
| 0.8236111111111111 | 25.419 |
| 0.8243055555555556 | 21.024 |
| 0.8250000000000001 | 21.024 |
| 0.8256944444444444 | 21.024 |
| 0.8263888888888888 | 21.024 |
| 0.8270833333333334 | 21.024 |
| 0.8277777777777778 | 21.024 |
| 0.8284722222222222 | 21.024 |
| 0.8291666666666666 | 16.636 |
| 0.8298611111111112 | 16.636 |
| 0.8305555555555556 | 16.636 |
| 0.8312499999999999 | 16.636 |
| 0.8319444444444444 | 12.257 |
| 0.8326388888888889 | 12.257 |
| 0.8333333333333334 | 12.257 |
| 0.8340277777777777 | 12.257 |
| 0.8347222222222223 | 12.257 |
| 0.8354166666666667 | 12.257 |
| 0.8361111111111111 | 7.887 |
| 0.8368055555555555 | 7.887 |
| 0.8375 | 7.887 |
| 0.8381944444444445 | 7.887 |
| 0.8388888888888889 | 7.887 |
| 0.8395833333333332 | 7.887 |
| 0.8402777777777778 | 3.525 |
| 0.8409722222222222 | 3.525 |
| 0.8416666666666667 | 3.525 |
| 0.842361111111111 | 3.525 |
| 0.8430555555555556 | 3.525 |
| 0.84375 | 3.525 |
| 0.8444444444444444 | 3.525 |
| 0.845138888888889 | 3.525 |
| 0.8458333333333333 | 0 |
| 0.8465277777777778 | 0 |
| 0.8472222222222222 | 0 |
| 0.8479166666666668 | 0 |
| 0.8486111111111111 | 0 |
| 0.8493055555555555 | 0 |
| 0.85 | 0 |
| 0.8506944444444445 | 0 |
| 0.8513888888888889 | 0 |
| 0.8520833333333333 | 0 |
| 0.8527777777777777 | 0 |
| 0.8534722222222223 | 0 |
| 0.8541666666666666 | 0 |
| 0.8548611111111111 | 0 |
| 0.8555555555555556 | 0 |
| 0.8562500000000001 | 0 |
| 0.8569444444444444 | 0 |
| 0.8576388888888888 | 0 |
| 0.8583333333333334 | 0 |
| 0.8590277777777778 | 0 |
| 0.8597222222222222 | 0 |
| 0.8604166666666666 | 0 |
| 0.8611111111111112 | 0 |
| 0.8618055555555556 | 0 |
| 0.8624999999999999 | 0 |
| 0.8631944444444444 | 0 |
| 0.8638888888888889 | 0 |
| 0.8645833333333334 | 0 |
| 0.8652777777777777 | 0 |
| 0.8659722222222223 | 0 |
| 0.8666666666666667 | 0 |
| 0.8673611111111111 | 0 |
| 0.8680555555555555 | 0 |
| 0.86875 | 0 |
| 0.8694444444444445 | 0 |
| 0.8701388888888889 | 0 |
| 0.8708333333333332 | 0 |
| 0.8715277777777778 | 0 |
| 0.8722222222222222 | 0 |
| 0.8729166666666667 | 0 |
| 0.873611111111111 | 0 |
| 0.8743055555555556 | 0 |
| 0.875 | 0 |
| 0.8756944444444444 | 0 |
| 0.876388888888889 | 0 |
| 0.8770833333333333 | 0 |
| 0.8777777777777778 | 0 |
| 0.8784722222222222 | 0 |
| 0.8791666666666668 | 0 |
| 0.8798611111111111 | 0 |
| 0.8805555555555555 | 0 |
| 0.88125 | 0 |
| 0.8819444444444445 | 0 |
| 0.8826388888888889 | 0 |
| 0.8833333333333333 | 0 |
| 0.8840277777777777 | 0 |
| 0.8847222222222223 | 0 |
| 0.8854166666666666 | 0 |
| 0.8861111111111111 | 0 |
| 0.8868055555555556 | 0 |
| 0.8875000000000001 | 0 |
| 0.8881944444444444 | 0 |
| 0.8888888888888888 | 0 |
| 0.8895833333333334 | 0 |
| 0.8902777777777778 | 0 |
| 0.8909722222222222 | 0 |
| 0.8916666666666666 | 0 |
| 0.8923611111111112 | 0 |
| 0.8930555555555556 | 0 |
| 0.8937499999999999 | 0 |
| 0.8944444444444444 | 0 |
| 0.8951388888888889 | 0 |
| 0.8958333333333334 | 0 |
| 0.8965277777777777 | 0 |
| 0.8972222222222223 | 0 |
| 0.8979166666666667 | 0 |
| 0.8986111111111111 | 0 |
| 0.8993055555555555 | 0 |
| 0.9 | 0 |
| 0.9006944444444445 | 0 |
| 0.9013888888888889 | 0 |
| 0.9020833333333332 | 0 |
| 0.9027777777777778 | 0 |
| 0.9034722222222222 | 0 |
| 0.9041666666666667 | 0 |
| 0.904861111111111 | 0 |
| 0.9055555555555556 | 0 |
| 0.90625 | 0 |
| 0.9069444444444444 | 0 |
| 0.907638888888889 | 0 |
| 0.9083333333333333 | 0 |
| 0.9090277777777778 | 0 |
| 0.9097222222222222 | 0 |
| 0.9104166666666668 | 0 |
| 0.9111111111111111 | 0 |
| 0.9118055555555555 | 0 |
| 0.9125 | 0 |
| 0.9131944444444445 | 0 |
| 0.9138888888888889 | 0 |
| 0.9145833333333333 | 0 |
| 0.9152777777777777 | 0 |
| 0.9159722222222223 | 0 |
| 0.9166666666666666 | 0 |
| 0.9173611111111111 | 0 |
| 0.9180555555555556 | 0 |
| 0.9187500000000001 | 0 |
| 0.9194444444444444 | 0 |
| 0.9201388888888888 | 0 |
| 0.9208333333333334 | 0 |
| 0.9215277777777778 | 0 |
| 0.9222222222222222 | 0 |
| 0.9229166666666666 | 0 |
| 0.9236111111111112 | 0 |
| 0.9243055555555556 | 0 |
| 0.9249999999999999 | 0 |
| 0.9256944444444444 | 0 |
| 0.9263888888888889 | 0 |
| 0.9270833333333334 | 0 |
| 0.9277777777777777 | 0 |
| 0.9284722222222223 | 0 |
| 0.9291666666666667 | 0 |
| 0.9298611111111111 | 0 |
| 0.9305555555555555 | 0 |
| 0.93125 | 0 |
| 0.9319444444444445 | 0 |
| 0.9326388888888889 | 0 |
| 0.9333333333333332 | 0 |
| 0.9340277777777778 | 0 |
| 0.9347222222222222 | 0 |
| 0.9354166666666667 | 0 |
| 0.936111111111111 | 0 |
| 0.9368055555555556 | 0 |
| 0.9375 | 0 |
| 0.9381944444444444 | 0 |
| 0.938888888888889 | 0 |
| 0.9395833333333333 | 0 |
| 0.9402777777777778 | 0 |
| 0.9409722222222222 | 0 |
| 0.9416666666666668 | 0 |
| 0.9423611111111111 | 0 |
| 0.9430555555555555 | 0 |
| 0.94375 | 0 |
| 0.9444444444444445 | 0 |
| 0.9451388888888889 | 0 |
| 0.9458333333333333 | 0 |
| 0.9465277777777777 | 0 |
| 0.9472222222222223 | 0 |
| 0.9479166666666666 | 0 |
| 0.9486111111111111 | 0 |
| 0.9493055555555556 | 0 |
| 0.9500000000000001 | 0 |
| 0.9506944444444444 | 0 |
| 0.9513888888888888 | 0 |
| 0.9520833333333334 | 0 |
| 0.9527777777777778 | 0 |
| 0.9534722222222222 | 0 |
| 0.9541666666666666 | 0 |
| 0.9548611111111112 | 0 |
| 0.9555555555555556 | 0 |
| 0.9562499999999999 | 0 |
| 0.9569444444444444 | 0 |
| 0.9576388888888889 | 0 |
| 0.9583333333333334 | 0 |
| 0.9590277777777777 | 0 |
| 0.9597222222222223 | 0 |
| 0.9604166666666667 | 0 |
| 0.9611111111111111 | 0 |
| 0.9618055555555555 | 0 |
| 0.9625 | 0 |
| 0.9631944444444445 | 0 |
| 0.9638888888888889 | 0 |
| 0.9645833333333332 | 0 |
| 0.9652777777777778 | 0 |
| 0.9659722222222222 | 0 |
| 0.9666666666666667 | 0 |
| 0.967361111111111 | 0 |
| 0.9680555555555556 | 0 |
| 0.96875 | 0 |
| 0.9694444444444444 | 0 |
| 0.970138888888889 | 0 |
| 0.9708333333333333 | 0 |
| 0.9715277777777778 | 0 |
| 0.9722222222222222 | 0 |
| 0.9729166666666668 | 0 |
| 0.9736111111111111 | 0 |
| 0.9743055555555555 | 0 |
| 0.975 | 0 |
| 0.9756944444444445 | 0 |
| 0.9763888888888889 | 0 |
| 0.9770833333333333 | 0 |
| 0.9777777777777777 | 0 |
| 0.9784722222222223 | 0 |
| 0.9791666666666666 | 0 |
| 0.9798611111111111 | 0 |
| 0.9805555555555556 | 0 |
| 0.9812500000000001 | 0 |
| 0.9819444444444444 | 0 |
| 0.9826388888888888 | 0 |
| 0.9833333333333334 | 0 |
| 0.9840277777777778 | 0 |
| 0.9847222222222222 | 0 |
| 0.9854166666666666 | 0 |
| 0.9861111111111112 | 0 |
| 0.9868055555555556 | 0 |
| 0.9874999999999999 | 0 |
| 0.9881944444444444 | 0 |
| 0.9888888888888889 | 0 |
| 0.9895833333333334 | 0 |
| 0.9902777777777777 | 0 |
| 0.9909722222222223 | 0 |
| 0.9916666666666667 | 0 |
| 0.9923611111111111 | 0 |
| 0.9930555555555555 | 0 |
| 0.99375 | 0 |
| 0.9944444444444445 | 0 |
| 0.9951388888888889 | 0 |
| 0.9958333333333332 | 0 |
| 0.9965277777777778 | 0 |
| 0.9972222222222222 | 0 |
| 0.9979166666666667 | 0 |
| 0.998611111111111 | 0 |
| 0.9993055555555556 | 0 |